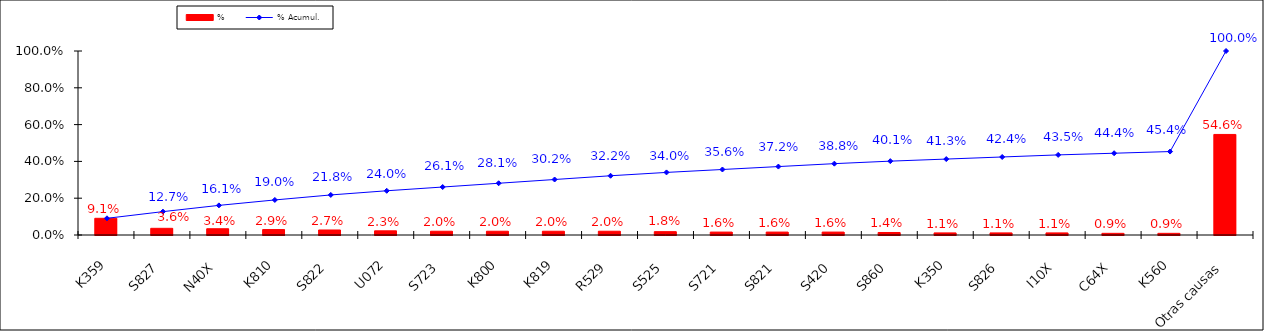
| Category | % |
|---|---|
| K359 | 0.091 |
| S827 | 0.036 |
| N40X | 0.034 |
| K810 | 0.029 |
| S822 | 0.027 |
| U072 | 0.023 |
| S723 | 0.02 |
| K800 | 0.02 |
| K819 | 0.02 |
| R529 | 0.02 |
| S525 | 0.018 |
| S721 | 0.016 |
| S821 | 0.016 |
| S420 | 0.016 |
| S860 | 0.014 |
| K350 | 0.011 |
| S826 | 0.011 |
| I10X | 0.011 |
| C64X | 0.009 |
| K560 | 0.009 |
| Otras causas | 0.546 |